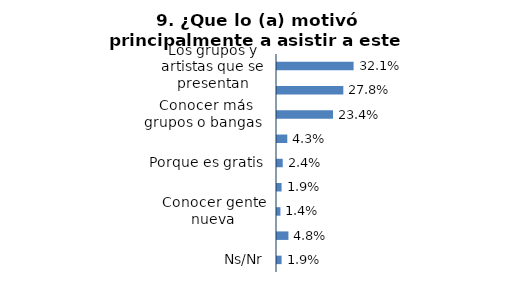
| Category | Series 0 |
|---|---|
| Los grupos y artistas que se presentan | 0.321 |
| Curiosidad por conocer este festival | 0.278 |
| Conocer más grupos o bangas  | 0.234 |
| Por costumbre | 0.043 |
| Porque es gratis | 0.024 |
| Encontrarse con otros amigos | 0.019 |
| Conocer gente nueva | 0.014 |
| Otro | 0.048 |
| Ns/Nr | 0.019 |